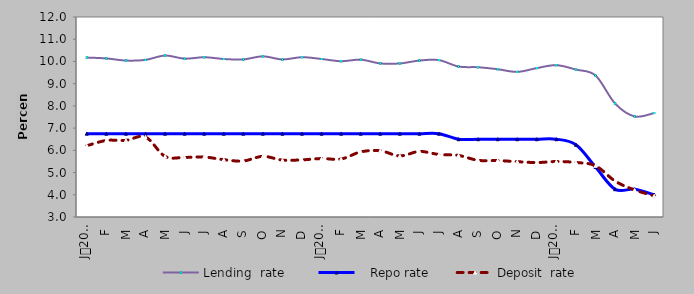
| Category | Lending  rate |    Repo rate | Deposit  rate |
|---|---|---|---|
| 0 | 10.174 | 6.75 | 6.207 |
| 1900-01-01 | 10.136 | 6.75 | 6.446 |
| 1900-01-02 | 10.04 | 6.75 | 6.45 |
| 1900-01-03 | 10.07 | 6.75 | 6.6 |
| 1900-01-04 | 10.265 | 6.75 | 5.728 |
| 1900-01-05 | 10.125 | 6.75 | 5.682 |
| 1900-01-06 | 10.19 | 6.75 | 5.7 |
| 1900-01-07 | 10.11 | 6.75 | 5.58 |
| 1900-01-08 | 10.09 | 6.75 | 5.52 |
| 1900-01-09 | 10.23 | 6.75 | 5.73 |
| 1900-01-10 | 10.09 | 6.75 | 5.56 |
| 1900-01-11 | 10.192 | 6.75 | 5.572 |
| 1900-01-12 | 10.11 | 6.75 | 5.63 |
| 1900-01-13 | 10.01 | 6.75 | 5.61 |
| 1900-01-14 | 10.08 | 6.75 | 5.93 |
| 1900-01-15 | 9.91 | 6.75 | 5.98 |
| 1900-01-16 | 9.91 | 6.75 | 5.75 |
| 1900-01-17 | 10.04 | 6.75 | 5.95 |
| 1900-01-18 | 10.06 | 6.75 | 5.813 |
| 1900-01-19 | 9.77 | 6.5 | 5.77 |
| 1900-01-20 | 9.74 | 6.5 | 5.55 |
| 1900-01-21 | 9.65 | 6.5 | 5.54 |
| 1900-01-22 | 9.53 | 6.5 | 5.49 |
| 1900-01-23 | 9.7 | 6.5 | 5.45 |
| 1900-01-24 | 9.833 | 6.5 | 5.497 |
| 1900-01-25 | 9.634 | 6.25 | 5.454 |
| 1900-01-26 | 9.369 | 5.25 | 5.304 |
| 1900-01-27 | 8.106 | 4.25 | 4.617 |
| 1900-01-28 | 7.526 | 4.25 | 4.216 |
| 1900-01-29 | 7.679 | 4 | 3.952 |